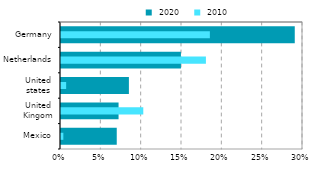
| Category |  2020 |
|---|---|
| Mexico | 0.069 |
| United
Kingom | 0.071 |
| United
states | 0.084 |
| Netherlands | 0.149 |
| Germany | 0.29 |